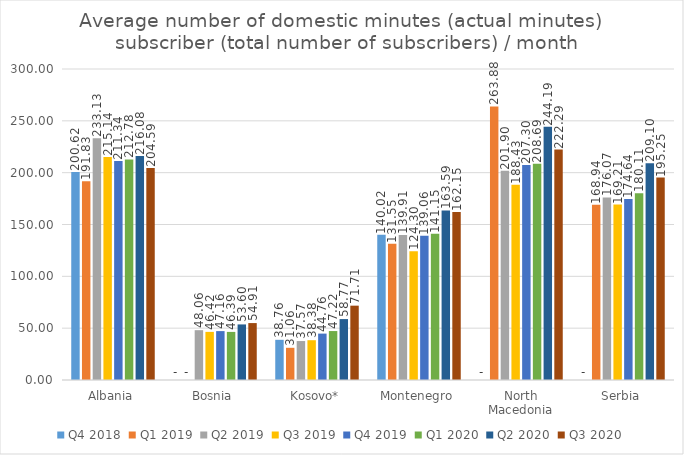
| Category | Q4 2018 | Q1 2019 | Q2 2019 | Q3 2019 | Q4 2019 | Q1 2020 | Q2 2020 | Q3 2020 |
|---|---|---|---|---|---|---|---|---|
| Albania | 200.625 | 191.827 | 233.13 | 215.144 | 211.34 | 212.777 | 216.083 | 204.586 |
| Bosnia | 0 | 0 | 48.06 | 46.419 | 47.165 | 46.393 | 53.605 | 54.909 |
| Kosovo* | 38.763 | 31.061 | 37.573 | 38.381 | 44.758 | 47.218 | 58.767 | 71.711 |
| Montenegro | 140.021 | 131.549 | 139.906 | 124.304 | 139.064 | 141.151 | 163.588 | 162.152 |
| North Macedonia | 0 | 263.88 | 201.903 | 188.428 | 207.299 | 208.692 | 244.189 | 222.293 |
| Serbia | 0 | 168.937 | 176.075 | 169.207 | 174.642 | 180.108 | 209.096 | 195.246 |